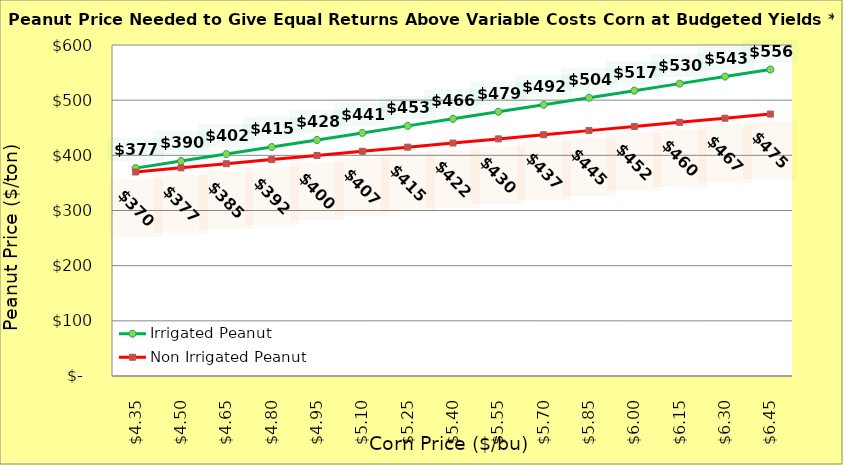
| Category | Irrigated Peanut | Non Irrigated Peanut |
|---|---|---|
| 4.349999999999998 | 376.808 | 369.8 |
| 4.499999999999998 | 389.574 | 377.3 |
| 4.649999999999999 | 402.34 | 384.8 |
| 4.799999999999999 | 415.106 | 392.3 |
| 4.949999999999999 | 427.872 | 399.8 |
| 5.1 | 440.637 | 407.3 |
| 5.25 | 453.403 | 414.8 |
| 5.4 | 466.169 | 422.3 |
| 5.550000000000001 | 478.935 | 429.8 |
| 5.700000000000001 | 491.701 | 437.3 |
| 5.850000000000001 | 504.467 | 444.8 |
| 6.000000000000002 | 517.233 | 452.3 |
| 6.150000000000002 | 529.999 | 459.8 |
| 6.3000000000000025 | 542.765 | 467.3 |
| 6.450000000000003 | 555.531 | 474.8 |